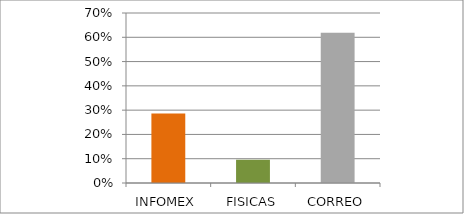
| Category | Series 0 |
|---|---|
| INFOMEX | 0.286 |
| FISICAS | 0.095 |
| CORREO | 0.619 |